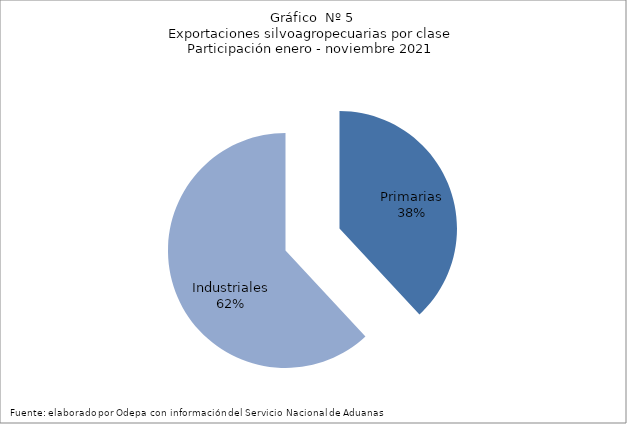
| Category | Series 0 |
|---|---|
| Primarias | 5983727 |
| Industriales | 9725797 |